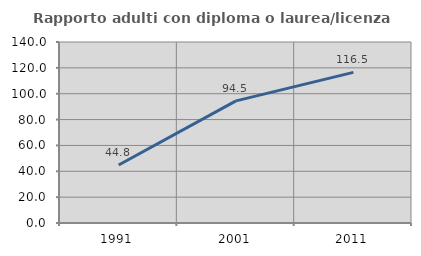
| Category | Rapporto adulti con diploma o laurea/licenza media  |
|---|---|
| 1991.0 | 44.841 |
| 2001.0 | 94.481 |
| 2011.0 | 116.489 |